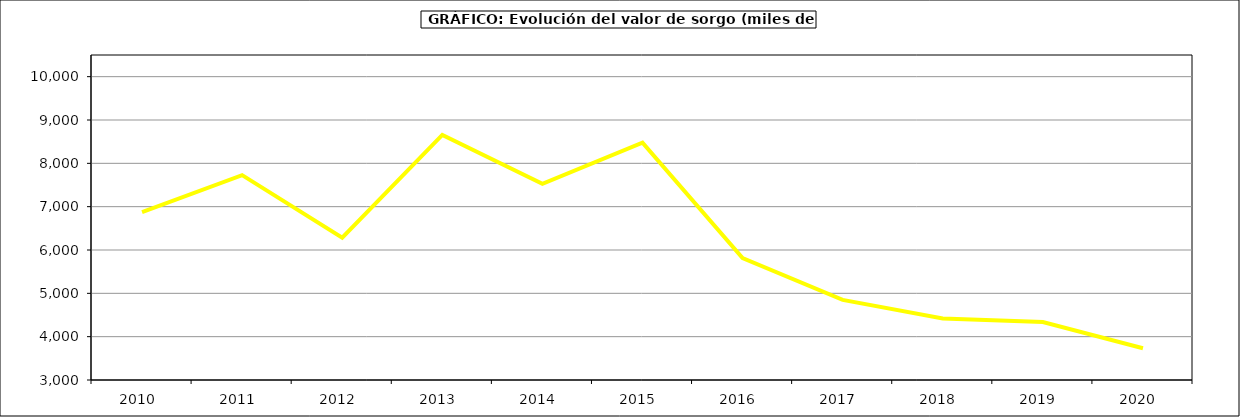
| Category | Producción |
|---|---|
| 2010.0 | 6873.468 |
| 2011.0 | 7728.6 |
| 2012.0 | 6283.71 |
| 2013.0 | 8656.32 |
| 2014.0 | 7525 |
| 2015.0 | 8476 |
| 2016.0 | 5814 |
| 2017.0 | 4849.204 |
| 2018.0 | 4421.779 |
| 2019.0 | 4336.822 |
| 2020.0 | 3732.028 |